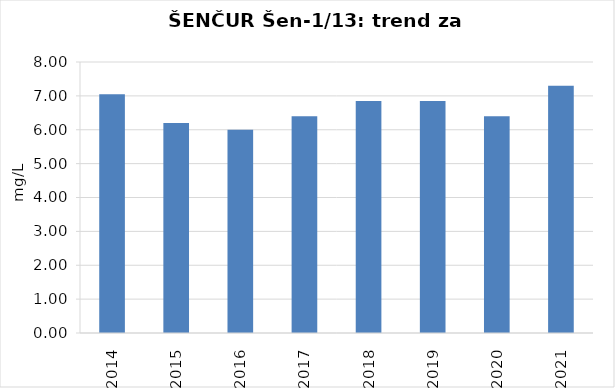
| Category | Vsota |
|---|---|
| 2014 | 7.05 |
| 2015 | 6.2 |
| 2016 | 6 |
| 2017 | 6.4 |
| 2018 | 6.85 |
| 2019 | 6.85 |
| 2020 | 6.4 |
| 2021 | 7.3 |